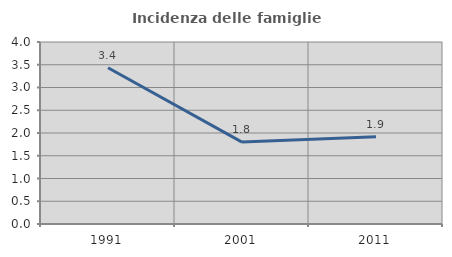
| Category | Incidenza delle famiglie numerose |
|---|---|
| 1991.0 | 3.434 |
| 2001.0 | 1.8 |
| 2011.0 | 1.917 |